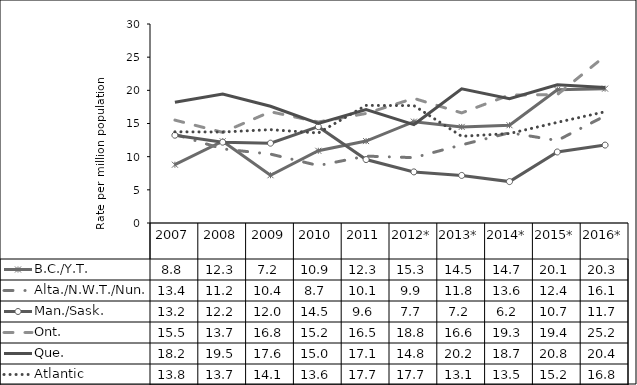
| Category | B.C./Y.T. | Alta./N.W.T./Nun. | Man./Sask. | Ont. | Que. | Atlantic |
|---|---|---|---|---|---|---|
| 2007 | 8.789 | 13.375 | 13.233 | 15.512 | 18.199 | 13.75 |
| 2008 | 12.322 | 11.169 | 12.189 | 13.662 | 19.455 | 13.716 |
| 2009 | 7.2 | 10.387 | 12.035 | 16.772 | 17.594 | 14.074 |
| 2010 | 10.888 | 8.663 | 14.522 | 15.226 | 15.008 | 13.566 |
| 2011 | 12.35 | 10.083 | 9.565 | 16.511 | 17.109 | 17.728 |
| 2012* | 15.276 | 9.851 | 7.705 | 18.787 | 14.841 | 17.697 |
| 2013* | 14.485 | 11.777 | 7.171 | 16.598 | 20.232 | 13.069 |
| 2014* | 14.737 | 13.61 | 6.244 | 19.291 | 18.747 | 13.489 |
| 2015* | 20.083 | 12.44 | 10.707 | 19.352 | 20.825 | 15.17 |
| 2016* | 20.254 | 16.15 | 11.747 | 25.173 | 20.418 | 16.771 |